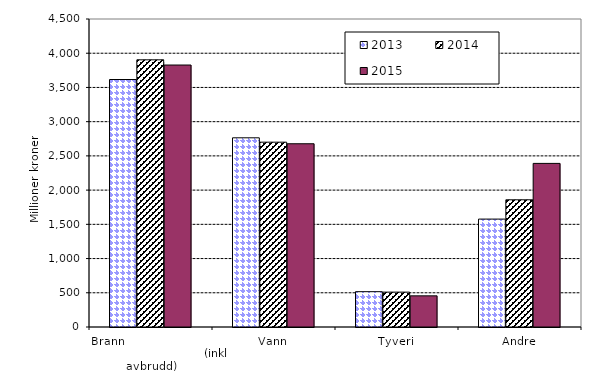
| Category | 2013 | 2014 | 2015 |
|---|---|---|---|
| Brann                                                       (inkl avbrudd) | 3616.044 | 3903.557 | 3827.682 |
| Vann | 2764.131 | 2700.231 | 2677.196 |
| Tyveri | 516.064 | 509.516 | 455.386 |
| Andre | 1576.574 | 1858.527 | 2390.283 |